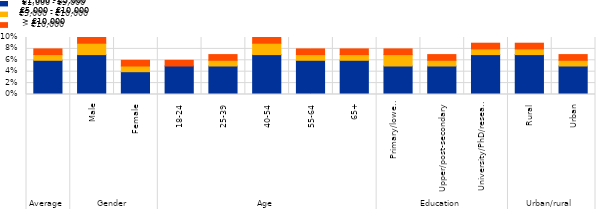
| Category |  €1,000 - €5,000 | €5,000 - €10,000 |  > €10,000 |
|---|---|---|---|
| 0 | 0.06 | 0.01 | 0.01 |
| 1 | 0.07 | 0.02 | 0.01 |
| 2 | 0.04 | 0.01 | 0.01 |
| 3 | 0.05 | 0 | 0.01 |
| 4 | 0.05 | 0.01 | 0.01 |
| 5 | 0.07 | 0.02 | 0.01 |
| 6 | 0.06 | 0.01 | 0.01 |
| 7 | 0.06 | 0.01 | 0.01 |
| 8 | 0.05 | 0.02 | 0.01 |
| 9 | 0.05 | 0.01 | 0.01 |
| 10 | 0.07 | 0.01 | 0.01 |
| 11 | 0.07 | 0.01 | 0.01 |
| 12 | 0.05 | 0.01 | 0.01 |